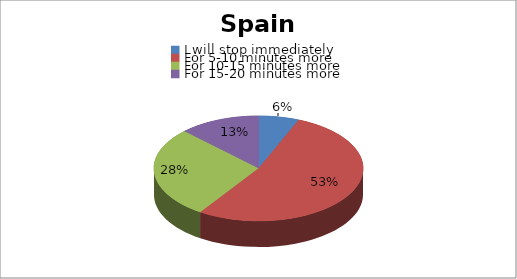
| Category | Series 0 |
|---|---|
| I will stop immediately | 2 |
| For 5-10 minutes more | 17 |
| For 10-15 minutes more | 9 |
| For 15-20 minutes more  | 4 |